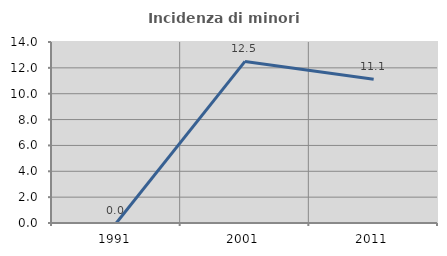
| Category | Incidenza di minori stranieri |
|---|---|
| 1991.0 | 0 |
| 2001.0 | 12.5 |
| 2011.0 | 11.111 |